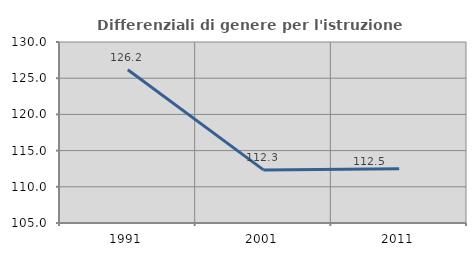
| Category | Differenziali di genere per l'istruzione superiore |
|---|---|
| 1991.0 | 126.167 |
| 2001.0 | 112.334 |
| 2011.0 | 112.476 |